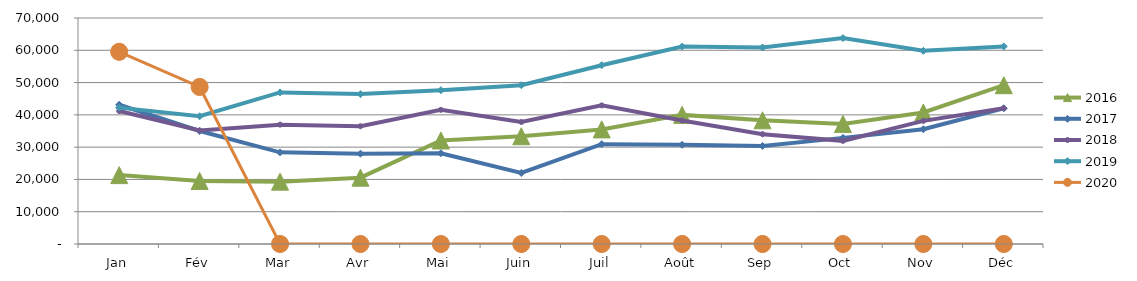
| Category | 2015 | 2016 | 2017 | 2018 | 2019 | 2020 |
|---|---|---|---|---|---|---|
| Jan |  | 21335.134 | 43138.429 | 41189.736 | 42238.432 | 59529.375 |
| Fév |  | 19532.337 | 35009.004 | 35137.047 | 39568.195 | 48642.784 |
| Mar |  | 19313.57 | 28389.673 | 36966.816 | 46942.202 | 0 |
| Avr |  | 20550.618 | 27972.802 | 36485.223 | 46427.766 | 0 |
| Mai |  | 32066.609 | 28116.194 | 41558.724 | 47634.031 | 0 |
| Juin |  | 33383.309 | 22002.869 | 37797.134 | 49186.221 | 0 |
| Juil |  | 35495.63 | 30926.131 | 42927.847 | 55367.883 | 0 |
| Août |  | 39992.765 | 30717.708 | 38263.165 | 61146.365 | 0 |
| Sep |  | 38306.611 | 30378.863 | 34011.672 | 60874.85 | 0 |
| Oct |  | 37188.976 | 32868.78 | 31946.792 | 63789.634 | 0 |
| Nov |  | 40729.636 | 35537.079 | 38139.513 | 59829.208 | 0 |
| Déc |  | 49180.232 | 42040.249 | 42064.579 | 61190.831 | 0 |